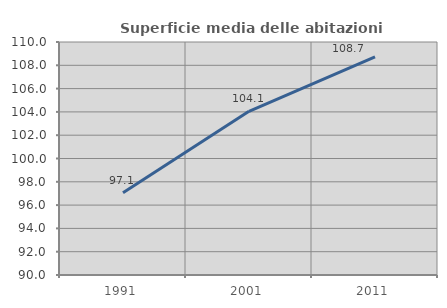
| Category | Superficie media delle abitazioni occupate |
|---|---|
| 1991.0 | 97.06 |
| 2001.0 | 104.05 |
| 2011.0 | 108.733 |